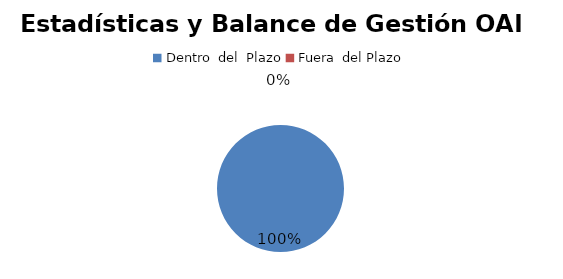
| Category | Series 0 |
|---|---|
| 0 | 8 |
| 1 | 0 |